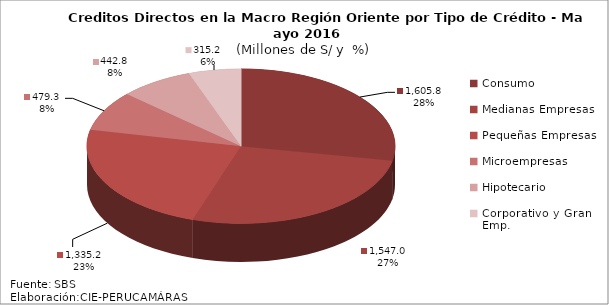
| Category | Series 0 |
|---|---|
| Consumo | 1605.824 |
| Medianas Empresas | 1547.007 |
| Pequeñas Empresas | 1335.212 |
| Microempresas | 479.261 |
| Hipotecario | 442.801 |
| Corporativo y Gran Emp. | 315.197 |